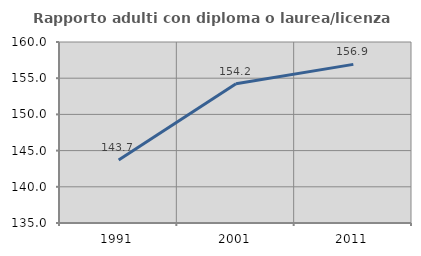
| Category | Rapporto adulti con diploma o laurea/licenza media  |
|---|---|
| 1991.0 | 143.689 |
| 2001.0 | 154.237 |
| 2011.0 | 156.911 |